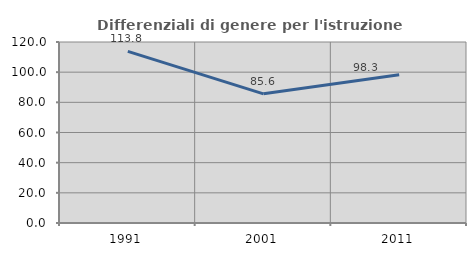
| Category | Differenziali di genere per l'istruzione superiore |
|---|---|
| 1991.0 | 113.753 |
| 2001.0 | 85.632 |
| 2011.0 | 98.327 |